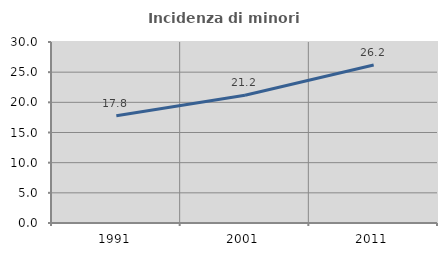
| Category | Incidenza di minori stranieri |
|---|---|
| 1991.0 | 17.763 |
| 2001.0 | 21.182 |
| 2011.0 | 26.189 |